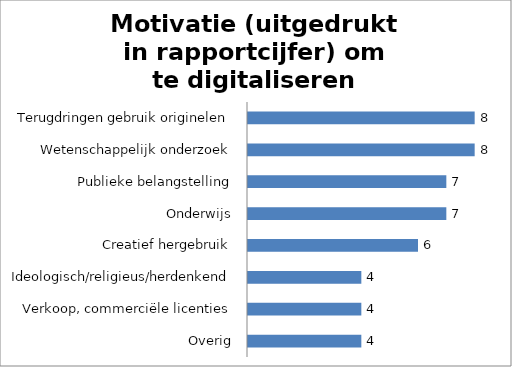
| Category | Series 0 |
|---|---|
| Overig | 4 |
| Verkoop, commerciële licenties | 4 |
| Ideologisch/religieus/herdenkend | 4 |
| Creatief hergebruik | 6 |
| Onderwijs | 7 |
| Publieke belangstelling | 7 |
| Wetenschappelijk onderzoek | 8 |
| Terugdringen gebruik originelen | 8 |